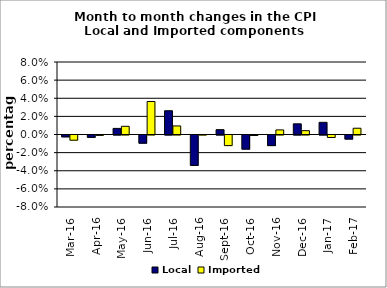
| Category | Local | Imported |
|---|---|---|
| 2016-03-01 | -0.002 | -0.006 |
| 2016-04-01 | -0.003 | 0 |
| 2016-05-01 | 0.007 | 0.009 |
| 2016-06-01 | -0.009 | 0.036 |
| 2016-07-01 | 0.026 | 0.009 |
| 2016-08-01 | -0.034 | 0 |
| 2016-09-01 | 0.005 | -0.012 |
| 2016-10-01 | -0.016 | -0.001 |
| 2016-11-01 | -0.012 | 0.005 |
| 2016-12-01 | 0.012 | 0.004 |
| 2017-01-01 | 0.013 | -0.003 |
| 2017-02-01 | -0.004 | 0.007 |